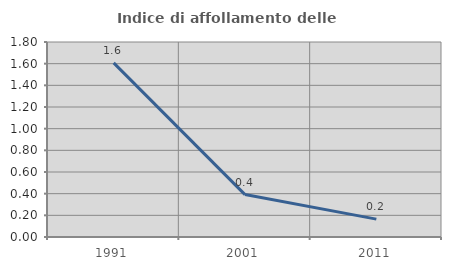
| Category | Indice di affollamento delle abitazioni  |
|---|---|
| 1991.0 | 1.607 |
| 2001.0 | 0.391 |
| 2011.0 | 0.165 |